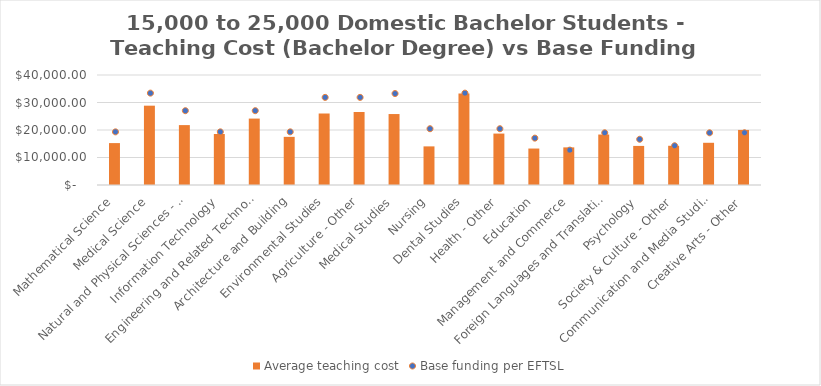
| Category | Average teaching cost |
|---|---|
| Mathematical Science | 15239.501 |
| Medical Science | 28842.976 |
| Natural and Physical Sciences - Other | 21782.237 |
| Information Technology | 18550.26 |
| Engineering and Related Technologies | 24151.072 |
| Architecture and Building | 17510.696 |
| Environmental Studies | 26001.069 |
| Agriculture - Other | 26547.602 |
| Medical Studies | 25803.078 |
| Nursing | 14042.831 |
| Dental Studies | 33274.14 |
| Health - Other | 18700.168 |
| Education | 13259.445 |
| Management and Commerce | 13680.967 |
| Foreign Languages and Translating | 18351.901 |
| Psychology | 14213.007 |
| Society & Culture - Other | 14264.751 |
| Communication and Media Studies | 15350.95 |
| Creative Arts - Other | 20019.85 |